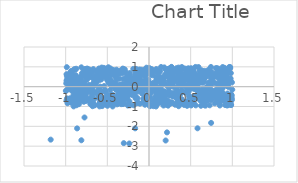
| Category | Series 0 |
|---|---|
| 0.7453362810049127 | -1.827 |
| 0.5821640453149111 | -2.099 |
| -0.30256776202869595 | -2.848 |
| -0.23624833604342288 | -2.865 |
| -0.8627793613922037 | -2.104 |
| -0.8117191933136036 | -2.703 |
| -0.16596986143107695 | -2.1 |
| 0.1998978025009055 | -2.714 |
| -1.1797748945858564 | -2.671 |
| 0.21610659210983285 | -2.305 |
| -0.7739092617140524 | -1.553 |
| -0.928273909744445 | 0.665 |
| -0.5043345749962 | 0.727 |
| 0.8477679397436035 | -0.84 |
| -0.04314057897971724 | 0.377 |
| -0.16159608527019964 | 0.732 |
| -0.3730215497132645 | 0.692 |
| -0.5939539670880067 | 0.338 |
| -0.6836080515452732 | -0.486 |
| -0.30260048704378173 | -0.192 |
| -0.8181662981648565 | -0.687 |
| -0.26341905305597524 | -0.046 |
| -0.7120444907975527 | -0.005 |
| 0.6252679619332415 | -0.725 |
| -0.521600891592567 | -0.804 |
| -0.571582556764562 | -0.228 |
| 0.6012143855452983 | 0.342 |
| -0.6840951324905875 | -0.759 |
| 0.5276762131817971 | 0.251 |
| 0.3345032930154983 | -0.617 |
| -0.6286872256077116 | -0.346 |
| 0.8289607307891411 | 0.598 |
| -0.7036586265834126 | -0.878 |
| 0.7441555701792983 | -0.641 |
| 0.36901187931114143 | 0.778 |
| -0.3185974315062359 | 0.136 |
| -0.35024249561616494 | -0.606 |
| -0.16546242574302905 | 0.587 |
| -0.22916088882853702 | 0.597 |
| 0.5790258990667578 | 0.508 |
| 0.33055511766926293 | 0.933 |
| 0.741841883858293 | 0.44 |
| -0.03841149524766352 | 0.825 |
| -0.08904310632435264 | -0.009 |
| 0.584502725595256 | -0.553 |
| 0.5177006752531375 | -0.734 |
| -0.7457914354320245 | 0.349 |
| 0.9568727888987645 | -0.761 |
| -0.7266344828115721 | -0.677 |
| 0.2974743977064662 | -0.018 |
| 0.08789154792246734 | 0.351 |
| 0.8837626512117076 | -0.293 |
| -0.5588851930525622 | -0.67 |
| -0.8095072964585861 | 0.155 |
| 0.18372699364748768 | -0.396 |
| 0.006795219263194374 | -0.754 |
| 0.8557734596826887 | 0.098 |
| 0.9378747380200603 | 0.631 |
| -0.3650807885346221 | 0.645 |
| 0.01752430031161545 | -0.539 |
| 0.4804823903491007 | 0.771 |
| 0.3128777910257179 | 0.838 |
| -0.407631608838521 | 0.653 |
| 0.8284085669024137 | 0.819 |
| 0.8348995610004197 | -0.182 |
| 0.22803242462148443 | 0.879 |
| 0.27514463007612644 | 0.698 |
| 0.6015958397941552 | -0.386 |
| -0.6394260397526397 | 0.274 |
| 0.17552527461374656 | -0.706 |
| -0.26906510958874885 | 0.515 |
| 0.8389956830568612 | 0.797 |
| -0.6054010808571324 | -0.075 |
| -0.8736026122042153 | 0.359 |
| 0.3132449682778282 | -0.911 |
| 0.8389928424979265 | 0.564 |
| 0.17775033098288473 | -0.776 |
| -0.22425968663009477 | -0.258 |
| -0.6943438642987041 | -0.834 |
| 0.38484011940968554 | 0.37 |
| -0.4515056360063854 | -0.392 |
| -0.7693515627614653 | -0.168 |
| 0.6945006971572925 | -0.74 |
| -0.5679667576693523 | 0.964 |
| 0.7356034695239224 | 0.656 |
| -0.7418136105335711 | 0.915 |
| -0.32244233929920196 | -0.329 |
| 0.24052342221087675 | 0.914 |
| 0.015289768394166403 | -0.041 |
| 0.8355265631485673 | 0.735 |
| 0.8844749079109979 | 0.989 |
| -0.29077475543493736 | -0.088 |
| 0.07970859204708813 | -0.154 |
| -0.3751957236555583 | -0.053 |
| 0.9141364865088228 | 0.417 |
| 0.8225045227517269 | 0.145 |
| -0.6524050559207684 | -0.937 |
| 0.7120196325504811 | -0.117 |
| -0.8878303705490396 | 0.247 |
| -0.10836296847897442 | -0.856 |
| 0.2772272774804705 | 0.186 |
| 0.010512047092438692 | -0.986 |
| 0.033081833823788154 | -0.926 |
| 0.8085724621575185 | -0.28 |
| 0.4415928416153987 | 0.362 |
| 0.023823890587578278 | 0.6 |
| -0.26720841948055685 | -0.553 |
| -0.4418805791621836 | 0.225 |
| 0.14281642483575996 | 0.205 |
| 0.908087324415346 | 0.751 |
| 0.31329853517655093 | -0.496 |
| -0.8958559970582884 | -0.529 |
| 0.8063829982031385 | -0.408 |
| 0.2344947971557294 | -0.825 |
| 0.29791823632910575 | 0.677 |
| -0.45135925762480134 | -0.817 |
| -0.19844141590774234 | 0.416 |
| 0.0717273637060305 | -0.173 |
| -0.928434749950561 | 0.733 |
| 0.48072717334670956 | 0.918 |
| 0.5396786920160364 | 0.723 |
| -0.45543856070046584 | 0.293 |
| -0.33665525899744364 | -0.372 |
| 0.27559915258634926 | 0.312 |
| 0.4671521271277628 | -0.163 |
| -0.16861175180631438 | 0.373 |
| 0.8209101895540989 | -0.328 |
| -0.264442511377478 | -0.264 |
| -0.9619134227011781 | -0.762 |
| 0.7532358930313381 | 0.634 |
| 0.09476070939653591 | -0.219 |
| -0.6170490488424571 | 0.374 |
| -0.3236105158511522 | 0.67 |
| -0.9158254895403941 | 0.496 |
| -0.02019705135788752 | 0.668 |
| 0.21350791347901588 | -0.372 |
| -0.045128205979239944 | 0.56 |
| -0.8572444498139873 | -0.392 |
| 0.9137433217671702 | -0.928 |
| 0.6674085488133632 | 0.432 |
| 0.2029880081902784 | -0.85 |
| 0.41454587755568584 | 0.538 |
| -0.10939699744490983 | 0.36 |
| -0.16781678438754355 | 0.328 |
| 0.09542816513581087 | 0.284 |
| 0.9844658344224508 | -0.403 |
| 0.2699027838277326 | -0.823 |
| -0.6685171571113917 | 0.886 |
| 0.5061553310522979 | -0.948 |
| -0.021560219674833903 | -0.625 |
| 0.19016805968102046 | -0.248 |
| -0.4303245197448744 | -0.425 |
| 0.5346980256963945 | 0.162 |
| -0.10023262360029461 | -0.102 |
| -0.2578979483288051 | 0.242 |
| 0.6333181022993897 | 0.696 |
| -0.5963227287429553 | 0.45 |
| 0.27296761095435107 | 0.473 |
| 0.15613433296307733 | 0.326 |
| 0.7887203784161574 | -0.323 |
| -0.25382681077465885 | -0.336 |
| 0.2973686111288867 | -0.31 |
| 0.7416586176737852 | 0.755 |
| -0.6063320532458638 | -0.537 |
| -0.42108121885773864 | 0.019 |
| 0.9771207109623576 | 0.409 |
| -0.1501185135935481 | 0.759 |
| 0.1116825761906386 | -0.27 |
| -0.27771762497034413 | 0.106 |
| -0.7350510744420375 | 0.533 |
| -0.38332107016194694 | -0.75 |
| -0.1583747910260751 | 0.873 |
| -0.03511457301917842 | -0.744 |
| 0.26869024321233015 | 0.847 |
| 0.1770997493245685 | 0.323 |
| 0.8863532490716972 | -0.059 |
| -0.6868782542156722 | -0.821 |
| -0.8398014082663394 | -0.551 |
| -0.553036058826397 | 0.616 |
| 0.944095594663257 | 0.792 |
| 0.8334437766493681 | -0.435 |
| 0.8153249463716248 | 0.932 |
| -0.3149772808492908 | 0.911 |
| -0.47622199673692167 | 0.225 |
| 0.7418933291048311 | -0.438 |
| -0.7527645317353227 | -0.307 |
| -0.7336816472801155 | -0.623 |
| -0.9683061822467749 | -0.743 |
| 0.7366684368105298 | 0.249 |
| 0.05542356938493498 | -0.68 |
| -0.9276370559112839 | 0.173 |
| 0.6144965346128279 | 0.537 |
| 0.7948585593653459 | -0.189 |
| -0.5969952154211842 | 0.503 |
| -0.7948879435596292 | -0.718 |
| 0.12638674164071118 | 0.802 |
| -0.08554048810980919 | -0.014 |
| -0.6170982324899823 | 0.364 |
| 0.10160815424530312 | -0.403 |
| 0.8326673072535395 | 0.909 |
| 0.9791784227359674 | -0.767 |
| -0.8796859135442023 | 0.579 |
| 0.8460327429705972 | -0.682 |
| 0.9634456317431483 | 0.992 |
| 0.5285352035511457 | 0.348 |
| -0.6547800430663595 | 0.235 |
| -0.6755265288325045 | -0.788 |
| 0.8431667008594803 | 0.622 |
| -0.006458159633995431 | -0.22 |
| 0.3391670069152104 | 0.717 |
| -0.7001961921484403 | 0.01 |
| -0.04620810953992849 | -0.499 |
| -0.11159562359069697 | -0.057 |
| 0.22915216407939587 | -0.958 |
| 0.2460340393809093 | -0.455 |
| 0.9416894546345569 | -0.571 |
| -0.9553123431159996 | -0.122 |
| 0.5376775594869037 | 0.217 |
| 0.47094870804063227 | -0.906 |
| 0.26942887086252965 | 0.997 |
| -0.87545666237308 | -0.766 |
| -0.8861645164628995 | -0.296 |
| 0.6572487936158209 | -0.853 |
| -0.08113115080738642 | -0.358 |
| 0.0033153114500374947 | 0.942 |
| 0.6009800012333097 | 0.551 |
| 0.4897200896051206 | 0.852 |
| 0.2392149455071768 | 0.282 |
| -0.9557039220834618 | 0.616 |
| 0.6232090314130516 | -0.963 |
| 0.46664801003871337 | 0.922 |
| 0.7300186709326737 | 0.045 |
| 0.3356362509532975 | -0.049 |
| 0.7284468634395884 | -0.94 |
| -0.463224480502314 | -0.159 |
| -0.40719733911594136 | 0.177 |
| -0.08303377145749113 | 0.259 |
| -0.4596659654174251 | 0.171 |
| -0.4771427327831994 | 0.221 |
| 0.9579774030671604 | -0.676 |
| -0.025583494246498306 | -0.506 |
| 0.33393898292598423 | -0.162 |
| 0.4811595872861971 | -0.509 |
| -0.4192661307679899 | 0.727 |
| -0.2341769157412641 | 0.472 |
| -0.46870995598591425 | 0.371 |
| 0.9031778806953952 | -0.715 |
| 0.5717535985104476 | 0.337 |
| 0.1756326334609999 | -0.292 |
| -0.15836249204422992 | 0.302 |
| -0.5656859135852939 | 0.618 |
| -0.8156355290684918 | 0.318 |
| 0.8904967088481095 | 0.205 |
| -0.1242060725086176 | 0.268 |
| 0.872146260450716 | 0.189 |
| -0.7535448310237574 | -0.202 |
| 0.9853025528439234 | -0.93 |
| -0.4526952631547434 | 0.589 |
| 0.4207306594532878 | -0.774 |
| -0.6002034302546913 | -0.882 |
| 0.15290140276196862 | -0.503 |
| 0.5607040497934674 | 0.007 |
| 0.18770432190580233 | -0.866 |
| -0.8209152583839749 | 0.468 |
| -0.24517620586986721 | -0.855 |
| 0.3866266234157596 | 0.878 |
| -0.4980670801396241 | -0.965 |
| 0.10805546680926903 | -0.305 |
| -0.7894014147958772 | -0.516 |
| 0.4251940998138193 | 0.889 |
| 0.3778337229704656 | 0.384 |
| -0.7941694367859131 | -0.387 |
| -0.42148133912836183 | 0.597 |
| -0.09935938652882892 | 0.169 |
| -0.03868931992645974 | -0.548 |
| 0.048292137326181095 | -0.095 |
| -0.187524496717554 | -0.12 |
| 0.22353455418979862 | 0.526 |
| -0.9842090474761047 | -0.592 |
| 0.16036154400707803 | 0.364 |
| -0.6462842650965672 | 0.095 |
| -0.932117592138497 | 0.362 |
| -0.7357035054528815 | -0.251 |
| -0.3301362988613492 | -0.248 |
| 0.6011214229971062 | -0.257 |
| 0.5907621427896321 | -0.497 |
| -0.5921355995411604 | -0.815 |
| -0.12469208886479954 | 0.179 |
| 0.15440164660387312 | -0.182 |
| 0.5499145908017189 | -0.124 |
| 0.7099430448667878 | -0.381 |
| 0.883101721506133 | 0.329 |
| 0.6256938310495177 | 0.203 |
| -0.19915183173272233 | -0.427 |
| -0.6386197460928025 | 0.22 |
| 0.9182927573803257 | -0.602 |
| 0.8724978791497358 | 0.482 |
| -0.36811636221150534 | -0.742 |
| -0.525494997312091 | 0.52 |
| -0.9327843122161898 | 0.724 |
| 0.7992363881611795 | -0.464 |
| -0.004931283898647498 | 0.242 |
| 0.19598317201784154 | 0.876 |
| 0.08215933337223569 | 0.506 |
| 0.9746094420577502 | 0.933 |
| 0.8874886969979803 | -0.644 |
| 0.9275832974621598 | 0.533 |
| -0.22706646750578896 | -0.348 |
| 0.21730640015708746 | 0.742 |
| 0.1022267483637973 | -0.87 |
| -0.5565278994538192 | 0.805 |
| 0.17396674748490892 | -0.951 |
| -0.9656764835438758 | -0.027 |
| -0.9850699646746186 | 0.527 |
| 0.4314959484154812 | 0.027 |
| -0.45930663722974696 | -0.45 |
| -0.3098710092036798 | 0.023 |
| -0.260676371185792 | -0.076 |
| 0.08726580926378613 | 0.889 |
| -0.9899638961480219 | 0.301 |
| 0.9863905555916561 | -0.711 |
| 0.681443839897163 | 0.535 |
| 0.5351445327485784 | 0.792 |
| 0.3531467229420384 | 0.46 |
| -0.5307657584014001 | -0.66 |
| -0.3481729777170046 | 0.805 |
| 0.27020654907453223 | 0.981 |
| 0.46202304292498786 | 0.659 |
| 0.8025057194263501 | -0.484 |
| -0.48275484921988765 | -0.448 |
| 0.6461775662524001 | 0.21 |
| -0.8055460633475806 | 0.669 |
| 0.9447181004140193 | 0.28 |
| -0.30495218506788646 | 0.387 |
| 0.3559539340527338 | -0.986 |
| -0.15208717944774275 | -0.003 |
| -0.1468299255082024 | 0.021 |
| -0.5080927954987826 | -0.748 |
| 0.868022044332293 | 0.757 |
| 0.7453106659201489 | -0.672 |
| -0.7081425842160189 | 0.77 |
| 0.6942326274361506 | -0.012 |
| -0.6077909555032124 | 0.594 |
| -0.05034537079656998 | 0.029 |
| -0.6001001263694343 | 0.621 |
| 0.4869606867465883 | 0.697 |
| -0.5318523950041962 | -0.243 |
| -0.8060226816688456 | -0.388 |
| 0.8447702529239021 | -0.851 |
| 0.3944422538778787 | 0.99 |
| 0.8455825354808302 | 0.512 |
| -0.2636028208759358 | -0.086 |
| 0.8745259231013165 | 0.563 |
| -0.2719039101265748 | -0.639 |
| 0.03551594706555283 | -0.173 |
| 0.8018445307718269 | 0.932 |
| -0.2875624328165245 | -0.404 |
| 0.7917483978827076 | 0.508 |
| 0.3882333082316811 | -0.327 |
| -0.8222123642712129 | -0.372 |
| 0.9586165472338113 | -0.873 |
| -0.29284089214072995 | -0.091 |
| 0.7774271347810138 | -0.383 |
| -0.4349768480323304 | 0.025 |
| 0.09499858738746148 | -0.012 |
| -0.13844663312931016 | -0.15 |
| 0.5939093583298236 | 0.989 |
| 0.9500512574549898 | -0.934 |
| -0.9862033725855923 | 0.982 |
| -0.849003762052688 | -0.515 |
| 0.5422165852217564 | 0.256 |
| -0.13796575222709362 | -0.583 |
| -0.3897178441986191 | 0.856 |
| -0.25383954539941644 | 0.254 |
| 0.45723082725999786 | -0.966 |
| -0.8884929001772903 | -0.63 |
| -0.8412580756285042 | -0.884 |
| -0.05771222562525935 | -0.647 |
| -0.045750159085040654 | 0.577 |
| 0.19051388823743576 | 0.121 |
| 0.6004223694725845 | -0.251 |
| -0.9657879208536753 | -0.072 |
| -0.7783008134071527 | 0.205 |
| -0.009084326476277216 | -0.366 |
| 0.43118090249978125 | 0.545 |
| -0.7955046598114093 | -0.691 |
| 0.41064729912161857 | 0.112 |
| 0.26388695397526707 | 0.682 |
| 0.26003533433718373 | -0.846 |
| 0.8708057101808813 | -0.344 |
| 0.17061814124436392 | 0.161 |
| -0.5621087486463419 | -0.98 |
| 0.707486085905698 | -0.544 |
| -0.4987152297206541 | 0.481 |
| -0.8871072606791905 | -0.269 |
| 0.014381971666852733 | -0.959 |
| 0.5363314713417018 | 0.183 |
| -0.702485686824426 | -0.584 |
| -0.10062682771249776 | -0.043 |
| 0.06749199425455621 | -0.211 |
| 0.08194078906138746 | 0.771 |
| -0.5053752588899247 | 0.591 |
| -0.8744072560432579 | -0.689 |
| -0.04682287175028921 | -0.46 |
| -0.17220062114678836 | -0.119 |
| 0.11103159551219832 | -0.362 |
| -0.3571551879514461 | 0.7 |
| -0.6750963624625199 | -0.249 |
| -0.875817160459077 | -0.719 |
| -0.0307549286525568 | 0.957 |
| -0.4309599996360902 | 0.836 |
| 0.6438616668887858 | 0.654 |
| 0.6928745751622722 | -0.36 |
| 0.07617819905203982 | -0.502 |
| 0.7669324972494413 | 0.507 |
| -0.5664710100670192 | -0.605 |
| 0.6712248778660102 | -0.361 |
| 0.3791978545989809 | 0.654 |
| 0.7808560544443834 | -0.276 |
| -0.3799324842519194 | -0.521 |
| -0.7212229343211634 | 0.084 |
| -0.9229956470946581 | -0.22 |
| 0.8970181587680217 | 0.352 |
| 0.5300381498386515 | 0.066 |
| 0.6499966193935443 | -0.707 |
| -0.4011072205627322 | 0.463 |
| 0.6756084563943063 | -0.298 |
| 0.6480297042731074 | -0.437 |
| 0.5285987104104206 | -0.609 |
| 0.8466114714408486 | -0.548 |
| -0.5337104865010165 | 0.904 |
| -0.16741289671609771 | 0.466 |
| 0.053159909338844846 | -0.984 |
| 0.1446968744409176 | 0.991 |
| 0.13270190277792882 | -0.392 |
| -0.9117484398526354 | 0.27 |
| -0.5992711763344352 | 0.738 |
| -0.9168796409784137 | 0.075 |
| 0.15923935429909153 | 0.455 |
| 0.37850851001661234 | 0.679 |
| -0.8731174267319659 | 0.903 |
| -0.8356505821083735 | -0.249 |
| -0.7820300242345848 | -0.761 |
| -0.8124973854347699 | 0.312 |
| -0.6507073463636781 | 0.538 |
| -0.10835712748254167 | 0.476 |
| -0.23316376404619765 | -0.187 |
| 0.03205073111311996 | 0.888 |
| 0.6315157322686054 | 0.237 |
| -0.6979615205267362 | 0.496 |
| -0.7750663906289428 | 0.02 |
| -0.3590520257005021 | -0.443 |
| 0.13886700939482233 | 0.256 |
| 0.6129464164917016 | 0.802 |
| -0.22881646487357754 | -0.942 |
| -0.15858970211033774 | -0.522 |
| -0.4419905976307137 | -0.613 |
| 0.893476670757551 | -0.679 |
| -0.09124413088774253 | -0.209 |
| -0.1700409513150789 | -0.088 |
| -0.7509062637516153 | 0.422 |
| 0.9298376481987052 | 0.484 |
| -0.7583645607740896 | -0.425 |
| -0.3243620909307996 | 0.819 |
| -0.9376079231383156 | 0.176 |
| 0.3681471471332738 | 0.429 |
| 0.36709676993327545 | 0.331 |
| 0.9068736313472343 | 0.949 |
| -0.6713364959554993 | -0.829 |
| -0.5869502265682454 | 0.007 |
| -0.3818573392196323 | -0.794 |
| 0.3009617077615394 | -0.449 |
| 0.8064829917029064 | -0.59 |
| 0.5089006279429042 | -0.055 |
| 0.581266468926392 | -0.023 |
| 0.7496212361956964 | -0.17 |
| -0.7158349585477666 | 0.701 |
| 0.8420026138560031 | -0.234 |
| 0.9950855363702362 | -0.66 |
| -0.18255183207435777 | -0.936 |
| -0.06173713400919367 | 0.582 |
| 0.7492230216403513 | 0.734 |
| 0.37223017672955105 | 0.478 |
| 0.5275529811405768 | -0.568 |
| -0.026458552181728656 | 0.168 |
| -0.4208796030356534 | -0.644 |
| -0.5179001476454987 | -0.899 |
| 0.9770570185662601 | 0.404 |
| 0.18347966817508188 | 0.972 |
| 0.37160736163670527 | 0.72 |
| 0.9276590989279143 | -0.653 |
| 0.629236803489541 | 0.829 |
| 0.7638652856072814 | -0.454 |
| 0.5850672708482509 | 0.351 |
| -0.007494018342381947 | 0.359 |
| 0.6087487196862593 | -0.666 |
| -0.38774139289419574 | 0.074 |
| -0.0266615642118615 | 0.721 |
| -0.10383306058455499 | 0.001 |
| -0.8999275119395176 | 0.865 |
| 0.5948149590998304 | 0.254 |
| 0.3290792893206138 | 0.812 |
| -0.3375229597453151 | -0.16 |
| -0.9978772735032455 | -0.212 |
| -0.4696484441259954 | -0.87 |
| -0.4117436286388374 | 0.109 |
| -0.637465092070721 | 0.793 |
| -0.06611130067868709 | 0.152 |
| -0.5522685262925029 | -0.825 |
| -0.22864080645674 | -0.327 |
| 0.7417245606958298 | 0.233 |
| 0.936696703400195 | -0.95 |
| 0.9020919988236655 | -0.657 |
| -0.3022776658840882 | -0.836 |
| -0.9543696248789479 | -0.767 |
| -0.18523560923690896 | 0.152 |
| -0.7517711404125136 | -0.716 |
| 0.5691942753935868 | -0.162 |
| 0.5099964245459438 | 0.557 |
| 0.5274737490331693 | -0.079 |
| 0.2584982517591137 | 0.898 |
| -0.9800754339253137 | 0.608 |
| -0.6785941832960012 | 0.118 |
| -0.6851671558208192 | -0.13 |
| 0.3862843873270798 | 0.039 |
| -0.8909305489741373 | 0.303 |
| -0.5239245023191981 | -0.546 |
| 0.4899350366259281 | 0.83 |
| 0.3739326745969689 | -0.868 |
| 0.3524475578319457 | 0.149 |
| 0.8215411082167141 | 0.473 |
| -0.4580859540746116 | 0.809 |
| 0.9276429592239566 | 0.649 |
| 0.5798715062124411 | -0.564 |
| 0.14529610889565614 | -0.599 |
| 0.13361856758449453 | -0.74 |
| -0.35211891961935016 | 0.107 |
| 0.27649570911075694 | 0.543 |
| 0.6160246210650175 | 0.409 |
| -0.9731801603238746 | 0.152 |
| -0.3805190045054896 | -0.167 |
| -0.2119983467617801 | -0.318 |
| 0.5013886335046629 | 0.91 |
| 0.9477299132369057 | 0.139 |
| -0.12453568676696003 | 0.369 |
| 0.35249031045889767 | -0.445 |
| 0.5686207478280656 | -0.427 |
| -0.06782449381002187 | -0.782 |
| -0.4591621264411734 | 0.068 |
| 0.6751845213478247 | -0.715 |
| 0.7482828787335776 | -0.235 |
| 0.8009693652287326 | 0.64 |
| 0.6830449693726455 | 0.498 |
| -0.39862840905530916 | 0.029 |
| 0.06830729082835907 | -0.801 |
| -0.7763250952362537 | -0.083 |
| 0.4407001562813815 | 0.642 |
| 0.4616646724756235 | -0.002 |
| -0.6572153570304167 | -0.308 |
| 0.20015008503957255 | -0.907 |
| 0.9428933723971191 | -0.345 |
| -0.16614982021473645 | 0.085 |
| 0.7550293851918473 | 0.312 |
| -0.03895393734005004 | 0.772 |
| -0.7187671683198229 | 0.872 |
| 0.6490372994681077 | -0.504 |
| -0.7457061331588195 | -0.634 |
| 0.3287488844848365 | 0.393 |
| 0.12066079204499847 | -0.656 |
| -0.9027537052977734 | -0.049 |
| -0.9562788149691679 | 0.631 |
| -0.892729607873856 | 0.875 |
| -0.5940640209523278 | 0.546 |
| 0.5607972892064785 | -0.945 |
| -0.8771573194052142 | -0.011 |
| -0.30996954219131645 | -0.877 |
| -0.20161538984509475 | 0.064 |
| 0.09481173637264972 | 0.295 |
| 0.7125860404290145 | 0.852 |
| 0.026237919182262814 | 0.738 |
| -0.06870529905851641 | -0.61 |
| -0.9110450839126571 | -0.634 |
| 0.5767524800715333 | 0.356 |
| 0.2991022859281569 | 0.31 |
| -0.24373310980653828 | 0.255 |
| -0.03976063072166247 | 0.635 |
| 0.7023459728549297 | -0.467 |
| -0.21464989709636617 | 0.325 |
| 0.2776991222365659 | -0.796 |
| 0.4897721962742534 | 0.56 |
| -0.8098910790764002 | -0.201 |
| -0.2901797123459231 | 0.869 |
| 0.2194849317328338 | 0.535 |
| -0.8467074510416388 | -0.757 |
| 0.09252741862169378 | 0.245 |
| 0.8078284925571926 | 0.696 |
| 0.681653658123053 | -0.238 |
| -0.5872038676042646 | -0.295 |
| 0.6966273324733558 | 0.641 |
| 0.4873638031053842 | -0.772 |
| 0.6793334034786429 | -0.43 |
| 0.4730384771233247 | 0.333 |
| 0.9390609357226598 | 0.031 |
| 0.5801756892591845 | 0.588 |
| 0.13605411180243498 | 0.015 |
| 0.20458331314028766 | -0.692 |
| 0.6836121364233116 | 0.753 |
| 0.4990172760641529 | 0.092 |
| 0.3270898452418003 | 0.467 |
| -0.8875143554596758 | -0.241 |
| -0.6008035772820051 | 0.917 |
| -0.1466594180980485 | 0.697 |
| 0.9818864111268255 | 0.684 |
| -0.461534843653594 | -0.756 |
| 0.4208970547278281 | 0.272 |
| 0.507499261113894 | 0.924 |
| -0.08765582955595574 | 0.853 |
| 0.7133489000254523 | 0.205 |
| 0.8960860975498917 | 0.722 |
| -0.9821523348315941 | 0.373 |
| 0.49288535479576256 | -0.073 |
| 0.3957959339884063 | -0.183 |
| 0.08816485254507 | -0.358 |
| -0.5783711932066153 | 0.816 |
| -0.7650112256465651 | 0.892 |
| 0.9990579167433076 | -0.151 |
| 0.1683022322265051 | 0.129 |
| -0.8695141305197707 | -0.938 |
| 0.4565848785961346 | -0.732 |
| 0.09525745080759984 | 0.399 |
| 0.8683400165579265 | 0.485 |
| -0.7575846203667975 | -0.7 |
| 0.931372637698779 | -0.441 |
| -0.2988212286173595 | -0.662 |
| 0.3566561359447451 | -0.264 |
| 0.032386955051678434 | 0.668 |
| -0.7007140890924395 | 0.055 |
| 0.49326371807485847 | 0.595 |
| 0.2430364531580287 | -0.319 |
| 0.18378540302032298 | -0.304 |
| 0.13925776238410914 | -0.446 |
| 0.5637688960160894 | 0.251 |
| 0.24407453481101182 | 0.582 |
| 0.5150805509261729 | 0.223 |
| -0.6711917216458039 | 0.014 |
| -0.4739512427065524 | -0.661 |
| -0.27773821723791126 | -0.243 |
| -0.3244212908348636 | -0.069 |
| 0.15248420313866884 | -0.579 |
| -0.9436305170499897 | 0.116 |
| -0.1845996295808361 | -0.215 |
| 0.789836436901576 | -0.84 |
| -0.7681740999339992 | 0.638 |
| 0.8565050817558049 | -0.577 |
| 0.23662567781360644 | -0.035 |
| -0.3887379136936111 | 0.351 |
| -0.012296985148781525 | 0.145 |
| 0.3658574013736795 | -0.673 |
| -0.34838355171086377 | -0.036 |
| -0.25897040554878537 | -0.558 |
| 0.6619792707828089 | 0.256 |
| 0.13633254071023093 | -0.801 |
| -0.43628919329973725 | -0.999 |
| -0.28512730380803375 | 0.752 |
| 0.06716390541112971 | 0.068 |
| 0.8254105780480823 | -0.729 |
| 0.08957817022334025 | -0.738 |
| -0.6894912539282456 | 0.513 |
| -0.935100469073153 | 0.772 |
| 0.10405646274653901 | -0.495 |
| 0.9620055226933815 | -0.452 |
| -0.8685018498729493 | 0.284 |
| 0.18809221153132683 | 0.138 |
| -0.528261603019841 | -0.201 |
| -0.3025431315248066 | -0.173 |
| 0.22729051548901413 | -0.37 |
| -0.26070894856245075 | -0.455 |
| 0.30597782856182243 | 0.374 |
| -0.09744462193221115 | 0.581 |
| 0.8459773807794058 | 0.637 |
| 0.3808800288032217 | -0.228 |
| -0.6778855191935247 | 0.744 |
| -0.17049484717734886 | -0.333 |
| 0.37961496683114615 | 0.622 |
| -0.25410499898192573 | 0.225 |
| 0.95450755764827 | -0.018 |
| -0.7173653095318713 | 0.727 |
| 0.2279264097568412 | -0.721 |
| 0.844767967391906 | -0.373 |
| -0.9738529069595541 | 0.549 |
| 0.6575990113724883 | 0.417 |
| -0.7347486159829208 | 0.664 |
| 0.7090701172119236 | 0.661 |
| -0.5169261883666165 | 0.904 |
| -0.5546273130886274 | -0.58 |
| 0.4556440059572566 | 0.396 |
| -0.7699300588143332 | -0.7 |
| 0.23742685004716657 | -0.835 |
| 0.8371539053345238 | 0.496 |
| -0.051302033347282894 | 0.708 |
| -0.4605030634391829 | 0.914 |
| 0.24565762039947003 | -0.026 |
| -0.7441094221405811 | -0.124 |
| 0.047343461435115364 | 0.176 |
| 0.1271149376381322 | 0.515 |
| -0.6303610607588201 | 0.405 |
| -0.08645363688207675 | -0.287 |
| -0.5138376465786973 | -0.688 |
| 0.545543534779307 | 0.658 |
| -0.5021696657685963 | 0.334 |
| 0.6635598344384774 | 0.797 |
| 0.8385885369511641 | -0.747 |
| -0.9348450868599751 | -0.809 |
| 0.4754616276581558 | 0.294 |
| -0.7518570123824393 | 0.777 |
| -0.7916840665199483 | 0.524 |
| 0.6775479146965593 | -0.957 |
| 0.5375088438571702 | -0.806 |
| -0.8550818249913013 | -0.557 |
| -0.6596176674707397 | 0.21 |
| -0.45663693096181945 | 0.669 |
| -0.0064296545590432075 | -0.533 |
| -0.5395413667302995 | 0.03 |
| -0.33786922970480937 | -0.297 |
| 0.8847088533915042 | 0.802 |
| 0.33438319096600577 | -0.819 |
| 0.25505849853676454 | 0.319 |
| 0.7396315375027156 | 0.603 |
| -0.048519380942802615 | -0.911 |
| 0.28695949381300756 | -0.499 |
| 0.8755615574638114 | -0.438 |
| -0.6414691968505637 | -0.251 |
| -0.888779573925746 | -0.789 |
| -0.13988043933974992 | 0.168 |
| 0.7242250695634878 | 0.144 |
| 0.5986624486252079 | 0.247 |
| 0.07130309373081722 | -0.859 |
| -0.37013813790613903 | -0.352 |
| -0.29805528341449494 | -0.306 |
| -0.6537796174776855 | 0.489 |
| 0.5128850785820775 | 0.008 |
| 0.2196063541303408 | 0.551 |
| 0.4120986130233526 | 0.628 |
| 0.7415409933056294 | -0.607 |
| 0.6771472182616605 | 0.717 |
| -0.8665892930678138 | -0.113 |
| 0.4765988353885815 | -0.239 |
| -0.3792368641039163 | -0.511 |
| -0.8430242519813329 | -0.072 |
| 0.5965064271055465 | -0.165 |
| 0.7433011442971205 | 0.993 |
| -0.2308238883197724 | 0.688 |
| 0.13154254939385934 | 0.764 |
| -0.43718874678137354 | 0.647 |
| 0.9640706509100574 | 0.951 |
| 0.6443289547620128 | -0.117 |
| 0.4743979890155099 | 0.458 |
| -0.23842591079075115 | -0.388 |
| 0.08733355665641351 | 0.791 |
| -0.8983925112537583 | 0.347 |
| -0.6062416147278047 | -0.568 |
| 0.3841990541918352 | 0.158 |
| -0.3644780488998065 | -0.659 |
| 0.8422921442374856 | -0.61 |
| -0.8523506331377333 | -0.564 |
| -0.6554425899235878 | -0.942 |
| 0.012476188731575188 | 0.161 |
| 0.3547379912609139 | 0.962 |
| -0.8926807394049006 | 0.219 |
| 0.42688896245510843 | 0.916 |
| -0.9898643411362804 | 0.625 |
| -0.692249432085493 | -0.32 |
| -0.352354350652369 | 0.405 |
| -0.23885157116385525 | -0.243 |
| -0.20297070002961126 | 0.127 |
| -0.9080519956135842 | -0.448 |
| 0.8668456975945091 | -0.013 |
| 0.7466526417320429 | 0.091 |
| 0.6530731051074055 | -0.088 |
| 0.28073786669236633 | -0.405 |
| 0.3151498321696289 | -0.375 |
| 0.8490844922988194 | 0.342 |
| -0.052111644144728464 | 0.778 |
| -0.8765081303015025 | -0.821 |
| 0.9955113705605547 | 0.217 |
| -0.2552612641818899 | 0.239 |
| -0.5189429912325241 | -0.831 |
| 0.7682413682764884 | -0.358 |
| 0.485049045562685 | -0.47 |
| 0.6467659113642881 | -0.407 |
| 0.2827598541092742 | 0.122 |
| 0.9922004324720852 | -0.569 |
| 0.015611852781462598 | -0.161 |
| -0.6563622945164791 | -0.62 |
| -0.6777152420664703 | -0.986 |
| 0.9698944097721092 | 0.946 |
| -0.2705355925230779 | 0.145 |
| 0.31704654009242805 | 0.774 |
| -0.0031823124690075755 | -0.883 |
| -0.9883374710578303 | -0.187 |
| 0.35786913779951446 | -0.374 |
| -0.09353179288175029 | -0.259 |
| -0.16997970501914494 | -0.456 |
| -0.3971624172154078 | -0.129 |
| 0.9071584530806927 | -0.443 |
| -0.2966034669343094 | 0.016 |
| -0.020138729562487967 | -0.161 |
| -0.9613749812698034 | -0.702 |
| 0.3089459129785541 | 0.258 |
| -0.8238522096213199 | 0.278 |
| -0.26344575285628324 | 0.272 |
| -0.9140012589083459 | 0.419 |
| -0.5121240977875943 | -0.315 |
| -0.9931023808749038 | 0.165 |
| -0.66804894216672 | 0.4 |
| -0.780332531608352 | 0.167 |
| -0.8826070508865262 | 0.861 |
| 0.6082844594785937 | 0.793 |
| -0.40655218781112223 | -0.048 |
| -0.7839090539444882 | 0.839 |
| -0.8939045680971818 | -0.615 |
| -0.8381285574327593 | -0.36 |
| -0.5275599894294778 | -0.167 |
| -0.38621156986056193 | 0.61 |
| -0.11614819677655652 | -0.084 |
| -0.08261516276733838 | 0.794 |
| 0.9165604223047368 | 0.097 |
| 0.3516853703627465 | 0.599 |
| -0.3737334804308876 | -0.819 |
| 0.5222945812922102 | 0.692 |
| -0.07403084066998056 | -0.302 |
| 0.9319642597806908 | 0.136 |
| 0.9668734829481769 | 0.952 |
| 0.3905017861275728 | -0.62 |
| 0.5543513586644855 | -0.113 |
| -0.12828324683358883 | -0.243 |
| -0.2029085466390843 | -0.006 |
| 0.8099610123881935 | 0.604 |
| -0.42878326673934364 | -0.639 |
| -0.08029476884358244 | 0.246 |
| 0.15123903380287196 | 0.053 |
| 0.12191992286961684 | -0.688 |
| -0.15333928313838396 | 0.89 |
| -0.3517757567997113 | -0.546 |
| -0.3929327968845646 | -0.755 |
| 0.5538047678449314 | 0.065 |
| 0.7978792732901168 | 0.586 |
| -0.5869322704397861 | -0.531 |
| 0.36477817310023375 | 0.636 |
| -0.5936617137846272 | -0.995 |
| -0.5763324576867035 | -0.879 |
| -0.7462401780777734 | -0.667 |
| 0.9326644904905408 | 0.103 |
| -0.9900824775032284 | -0.696 |
| 0.5235778810454152 | -0.088 |
| -0.499153778652921 | -0.645 |
| 0.8406399795497423 | -0.736 |
| 0.9582716092505899 | 0.275 |
| 0.23984591756092777 | -0.221 |
| -0.32917644520784295 | -0.817 |
| -0.12270203303400429 | -0.826 |
| -0.4198223199632585 | 0.816 |
| -0.3443884322756521 | -0.376 |
| 0.4403437484384989 | 0.421 |
| 0.140299199534915 | 0.304 |
| -0.16155537541072995 | -0.588 |
| 0.08406534599923532 | -1 |
| -0.3399152547590838 | -0.831 |
| -0.48762554363789334 | 0.196 |
| -0.7328501457748984 | 0.435 |
| 0.5833694027413803 | 0.017 |
| -0.20849923027271844 | -0.356 |
| -0.013606044903593295 | -0.667 |
| -0.4094154876059126 | -0.836 |
| -0.9414348520441249 | 0.728 |
| -0.74555731148121 | 0.849 |
| 0.557991078986158 | 0.994 |
| -0.9043910207526906 | -0.995 |
| -0.46471412097630305 | 0.278 |
| -0.31389883080224656 | -0.588 |
| 0.9854707352820855 | -0.91 |
| -0.18844608017241837 | 0.896 |
| -0.33327666010704915 | -0.883 |
| 0.10244187865921472 | -0.068 |
| -0.5724163257373394 | 0.363 |
| -0.18904219001731937 | -0.127 |
| 0.9112504471968299 | 0.372 |
| -0.6350469335100424 | 0.354 |
| 0.07815715472408513 | 0.768 |
| 0.19077500102603362 | 0.6 |
| -0.007468401824753945 | 0.212 |
| -0.8123807890077572 | -0.468 |
| 0.19434433924928984 | -0.534 |
| -0.06966031440579257 | -0.12 |
| -0.14483959369029353 | -0.825 |
| 0.8115314793687345 | -0.69 |
| -0.16724789479719848 | 0.372 |
| -0.04760432164251838 | 0.869 |
| 0.10627437780757454 | -0.589 |
| -0.3249116065491995 | -0.133 |
| 0.048479627541926584 | 0.051 |
| 0.25963251883477634 | -0.787 |
| -0.2930855225067155 | 0.734 |
| -0.3822906551419236 | -0.892 |
| 0.11346311310454116 | -0.477 |
| 0.8248053501373589 | -0.732 |
| -0.30582809768550767 | 0.884 |
| 0.45735236810325786 | -0.157 |
| 0.37586954137987694 | 0.439 |
| 0.15762445650648882 | -0.657 |
| -0.9299608233123098 | 0.791 |
| 0.6946299268380223 | -0.686 |
| -0.8442345911962261 | 0.102 |
| 0.44578607877549237 | 0.712 |
| 0.09851770928515369 | -0.405 |
| 0.13309934199128892 | 0.335 |
| -0.23444040186581194 | -0.741 |
| -0.6894358618579237 | 0.505 |
| -0.6900205824865477 | -0.115 |
| -0.9496966524087889 | -0.587 |
| -0.0031295059067766307 | 0.87 |
| -0.7670842382906202 | 0.868 |
| 0.04352671160017607 | 0.573 |
| 0.4413564630125957 | -0.305 |
| -0.5423227781173092 | 0.948 |
| -0.9742326379800705 | -0.769 |
| -0.0980545467722671 | 0.77 |
| 0.6663432294582063 | -0.931 |
| -0.11344501779187377 | 0.866 |
| -0.9023040746400561 | 0.018 |
| 0.5290545445682711 | 0.349 |
| 0.4507904215967573 | 0.6 |
| 0.2592990306260936 | 0.216 |
| -0.9174895420410825 | 0.556 |
| -0.17882936982306363 | -0.348 |
| 0.18346852310083706 | -0.24 |
| -0.27320367634477805 | -0.494 |
| -0.4871252002763471 | 0.979 |
| 0.27248096262201527 | -0.417 |
| 0.42151062362916614 | -0.923 |
| 0.11374117110524917 | -0.667 |
| 0.7987109786340243 | 0.168 |
| 0.7646322628782982 | 0.296 |
| 0.3089536458866855 | 0.436 |
| -0.20595502290899637 | 0.062 |
| -0.5264909099127844 | 0.802 |
| 0.3607998760970099 | 0.801 |
| -0.8117327823627938 | 0.975 |
| 0.533583856497146 | -0.519 |
| 0.9854766276770315 | -0.385 |
| 0.2732113065362769 | 0.565 |
| 0.6011835260299663 | 0.54 |
| 0.12271816701545335 | -0.493 |
| 0.45873277892644415 | 0.074 |
| -0.6207744504123787 | 0.731 |
| 0.9033321894323187 | 0.349 |
| 0.6342990287265187 | -0.247 |
| -0.8131625224032728 | 0.511 |
| 0.10746571178987563 | 0.702 |
| 0.364406990316654 | -0.347 |
| -0.46969556750494235 | 0.793 |
| 0.11294657434378319 | -0.399 |
| 0.048845493025378106 | 0.164 |
| 0.8494243346367112 | -0.949 |
| -0.7725467114472877 | -0.674 |
| 0.933724251795861 | 0.397 |
| -0.03146236197448893 | 0.792 |
| 0.25613466409036123 | 0.319 |
| -0.9425664275381631 | -0.759 |
| -0.536780161513543 | 0.493 |
| -0.1491355978780846 | 0.53 |
| -0.019534386551018246 | 0.918 |
| 0.9740571826525266 | 0.987 |
| -0.6314186801984145 | 0.217 |
| -0.977564225131851 | -0.837 |
| -0.8446863300689107 | -0.049 |
| -0.23879826068347532 | -0.212 |
| -0.5964302527150471 | 0.846 |
| 0.5274735188063719 | -0.59 |
| 0.5238835400495769 | 0.467 |
| 0.9933295922568508 | -0.444 |
| -0.39986258492171767 | -0.138 |
| -0.8587776630507076 | 0.47 |
| -0.25435318884913216 | -0.952 |
| -0.057667444189173134 | 0.048 |
| -0.7073749422810442 | -0.12 |
| 0.8189687396809187 | -0.111 |
| -0.8134046074157046 | 0.047 |
| 0.09416273161501931 | -0.747 |
| -0.4535410769154826 | 0.07 |
| -0.28113615895286537 | -0.185 |
| 0.020899259839528783 | -0.328 |
| 0.21886552616499544 | 0.049 |
| -0.022995524956321622 | -0.082 |
| 0.22255530279214097 | -0.334 |
| 0.6502865474369885 | 0.255 |
| -0.26816691071920995 | -0.3 |
| 0.18144330025016164 | 0.462 |
| -0.3553573008287516 | -0.838 |